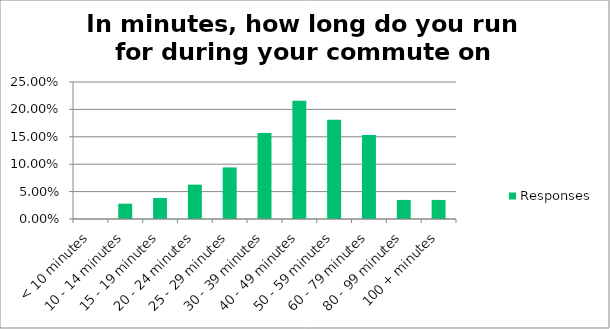
| Category | Responses |
|---|---|
| < 10 minutes | 0 |
| 10 - 14 minutes | 0.028 |
| 15 - 19 minutes | 0.038 |
| 20 - 24 minutes | 0.063 |
| 25 - 29 minutes | 0.094 |
| 30 - 39 minutes | 0.157 |
| 40 - 49 minutes | 0.216 |
| 50 - 59 minutes | 0.181 |
| 60 - 79 minutes | 0.153 |
| 80 - 99 minutes | 0.035 |
| 100 + minutes | 0.035 |